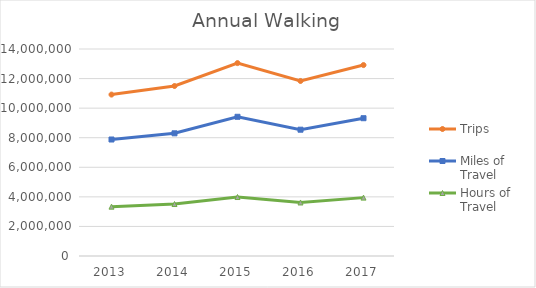
| Category | Trips | Miles of Travel | Hours of Travel |
|---|---|---|---|
| 2013 | 10917365.517 | 7878407.652 | 3338066.387 |
| 2014 | 11497406.031 | 8296988.088 | 3515418.124 |
| 2015 | 13046424.766 | 9414821.968 | 3989042.22 |
| 2016 | 11837809.268 | 8542636.68 | 3619498.967 |
| 2017 | 12913393.574 | 9318821.339 | 3948366.936 |